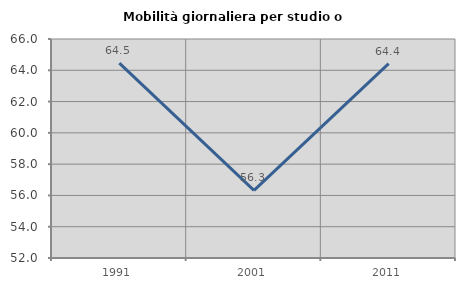
| Category | Mobilità giornaliera per studio o lavoro |
|---|---|
| 1991.0 | 64.455 |
| 2001.0 | 56.328 |
| 2011.0 | 64.422 |